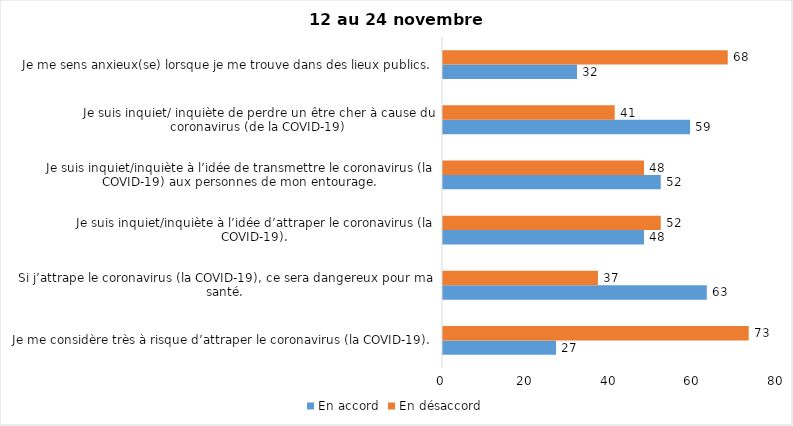
| Category | En accord | En désaccord |
|---|---|---|
| Je me considère très à risque d’attraper le coronavirus (la COVID-19). | 27 | 73 |
| Si j’attrape le coronavirus (la COVID-19), ce sera dangereux pour ma santé. | 63 | 37 |
| Je suis inquiet/inquiète à l’idée d’attraper le coronavirus (la COVID-19). | 48 | 52 |
| Je suis inquiet/inquiète à l’idée de transmettre le coronavirus (la COVID-19) aux personnes de mon entourage. | 52 | 48 |
| Je suis inquiet/ inquiète de perdre un être cher à cause du coronavirus (de la COVID-19) | 59 | 41 |
| Je me sens anxieux(se) lorsque je me trouve dans des lieux publics. | 32 | 68 |